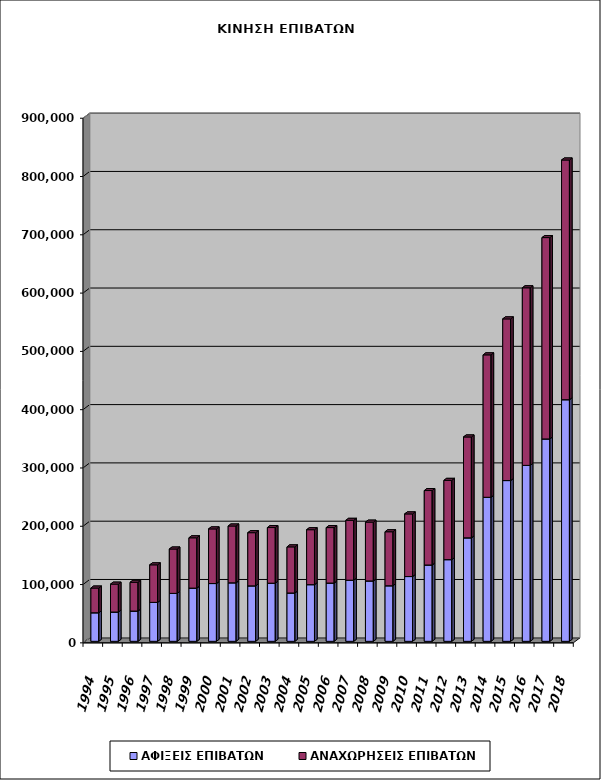
| Category | ΑΦΙΞΕΙΣ ΕΠΙΒΑΤΩΝ | ΑΝΑΧΩΡΗΣΕΙΣ ΕΠΙΒΑΤΩΝ |
|---|---|---|
| 1994.0 | 48990 | 42429 |
| 1995.0 | 50256 | 47864 |
| 1996.0 | 51957 | 49354 |
| 1997.0 | 66803 | 64400 |
| 1998.0 | 82249 | 76116 |
| 1999.0 | 91299 | 86316 |
| 2000.0 | 99132 | 93740 |
| 2001.0 | 100390 | 97474 |
| 2002.0 | 95158 | 91214 |
| 2003.0 | 99758 | 95445 |
| 2004.0 | 82944 | 79099 |
| 2005.0 | 97226 | 94262 |
| 2006.0 | 99999 | 95150 |
| 2007.0 | 104901 | 102697 |
| 2008.0 | 103599 | 100888 |
| 2009.0 | 95332 | 92657 |
| 2010.0 | 111136 | 107467 |
| 2011.0 | 130974 | 127710 |
| 2012.0 | 140131 | 136023 |
| 2013.0 | 177540 | 173070 |
| 2014.0 | 247126 | 244338 |
| 2015.0 | 275812 | 277344 |
| 2016.0 | 301842 | 304659 |
| 2017.0 | 347225 | 345394 |
| 2018.0 | 414511 | 411234 |